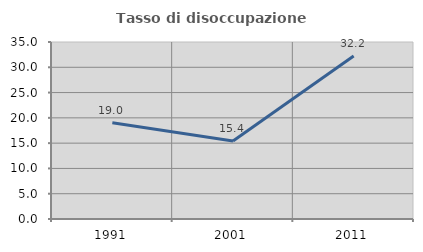
| Category | Tasso di disoccupazione giovanile  |
|---|---|
| 1991.0 | 19.027 |
| 2001.0 | 15.432 |
| 2011.0 | 32.231 |